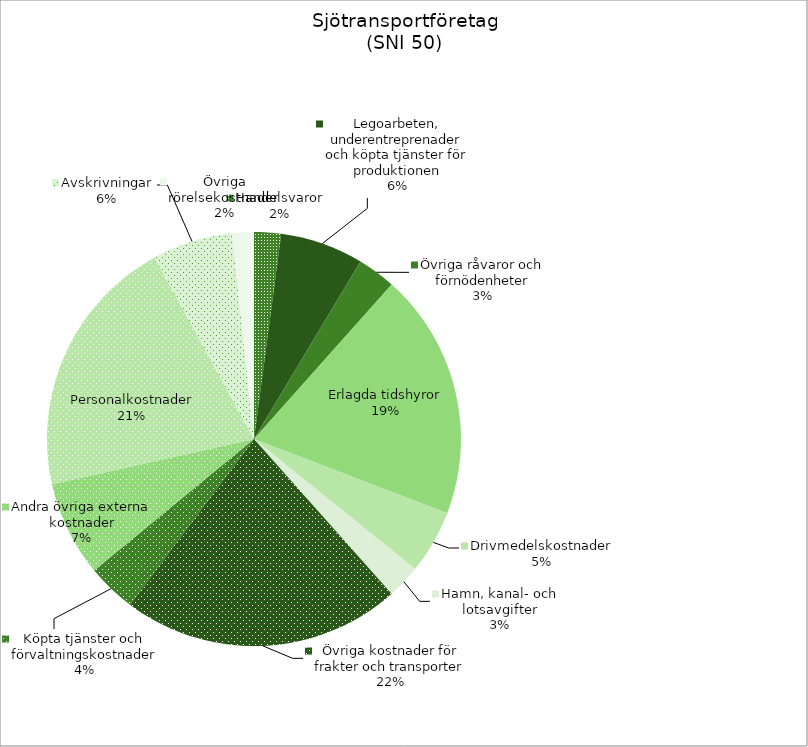
| Category | Series 0 |
|---|---|
| Handelsvaror | 645.705 |
| Legoarbeten, underentreprenader och köpta tjänster för produktionen | 1998.426 |
| Övriga råvaror och förnödenheter | 914.45 |
| Erlagda tidshyror | 5920.015 |
| Drivmedelskostnader | 1521.701 |
| Hamn, kanal- och lotsavgifter | 807.661 |
| Övriga kostnader för frakter och transporter | 6698.373 |
| Köpta tjänster och förvaltningskostnader | 1173.004 |
| Andra övriga externa kostnader | 2290.248 |
| Personalkostnader | 6308.406 |
| Avskrivningar | 1930.289 |
| Övriga rörelsekostnader | 521.174 |